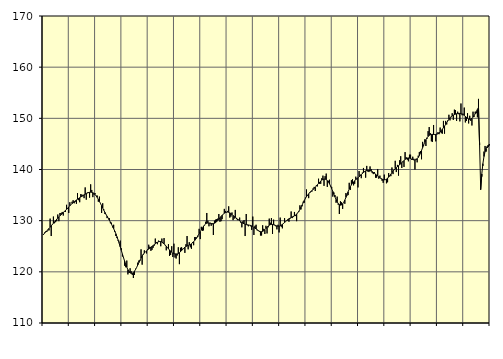
| Category | Samtliga sysselsatta (inkl. sysselsatta utomlands) | Series 1 |
|---|---|---|
| nan | 127.2 | 127.34 |
| 87.0 | 127.7 | 127.56 |
| 87.0 | 127.9 | 127.76 |
| 87.0 | 127.8 | 128 |
| 87.0 | 128.1 | 128.24 |
| 87.0 | 128.1 | 128.49 |
| 87.0 | 130.4 | 128.73 |
| 87.0 | 127 | 128.98 |
| 87.0 | 129.3 | 129.24 |
| 87.0 | 130.8 | 129.5 |
| 87.0 | 129.5 | 129.76 |
| 87.0 | 129.7 | 130.01 |
| nan | 129.9 | 130.27 |
| 88.0 | 131.2 | 130.51 |
| 88.0 | 129.9 | 130.74 |
| 88.0 | 131.5 | 130.96 |
| 88.0 | 131.5 | 131.17 |
| 88.0 | 131.7 | 131.37 |
| 88.0 | 131 | 131.57 |
| 88.0 | 131.7 | 131.78 |
| 88.0 | 131.7 | 132 |
| 88.0 | 133.1 | 132.22 |
| 88.0 | 132.3 | 132.44 |
| 88.0 | 131.5 | 132.67 |
| nan | 133.6 | 132.9 |
| 89.0 | 133.1 | 133.12 |
| 89.0 | 133.7 | 133.34 |
| 89.0 | 134 | 133.53 |
| 89.0 | 133.4 | 133.71 |
| 89.0 | 133.7 | 133.88 |
| 89.0 | 133.3 | 134.04 |
| 89.0 | 135.4 | 134.2 |
| 89.0 | 134 | 134.35 |
| 89.0 | 133.6 | 134.48 |
| 89.0 | 135.2 | 134.62 |
| 89.0 | 135.1 | 134.76 |
| nan | 134.8 | 134.91 |
| 90.0 | 134.4 | 135.05 |
| 90.0 | 136.5 | 135.18 |
| 90.0 | 134.1 | 135.3 |
| 90.0 | 135.5 | 135.4 |
| 90.0 | 135.6 | 135.48 |
| 90.0 | 134.5 | 135.54 |
| 90.0 | 137.1 | 135.56 |
| 90.0 | 136 | 135.54 |
| 90.0 | 134.6 | 135.46 |
| 90.0 | 135.1 | 135.32 |
| 90.0 | 135.4 | 135.12 |
| nan | 134.9 | 134.85 |
| 91.0 | 134.9 | 134.54 |
| 91.0 | 133.7 | 134.17 |
| 91.0 | 134.7 | 133.77 |
| 91.0 | 133.3 | 133.35 |
| 91.0 | 131.5 | 132.91 |
| 91.0 | 133.4 | 132.47 |
| 91.0 | 132.2 | 132.04 |
| 91.0 | 131.3 | 131.63 |
| 91.0 | 131.2 | 131.24 |
| 91.0 | 130.5 | 130.87 |
| 91.0 | 130.5 | 130.5 |
| nan | 130.5 | 130.12 |
| 92.0 | 129.5 | 129.73 |
| 92.0 | 129.6 | 129.32 |
| 92.0 | 128.7 | 128.89 |
| 92.0 | 129.2 | 128.44 |
| 92.0 | 127.8 | 127.96 |
| 92.0 | 127 | 127.44 |
| 92.0 | 126.6 | 126.87 |
| 92.0 | 126.1 | 126.25 |
| 92.0 | 125.7 | 125.59 |
| 92.0 | 126.1 | 124.89 |
| 92.0 | 124.6 | 124.18 |
| nan | 123 | 123.47 |
| 93.0 | 122.9 | 122.77 |
| 93.0 | 121.2 | 122.1 |
| 93.0 | 120.9 | 121.47 |
| 93.0 | 122.2 | 120.9 |
| 93.0 | 119.5 | 120.42 |
| 93.0 | 119.8 | 120.05 |
| 93.0 | 120.7 | 119.8 |
| 93.0 | 120.1 | 119.7 |
| 93.0 | 119.4 | 119.72 |
| 93.0 | 118.8 | 119.87 |
| 93.0 | 119.4 | 120.12 |
| nan | 120.6 | 120.47 |
| 94.0 | 120.9 | 120.88 |
| 94.0 | 121.8 | 121.34 |
| 94.0 | 122.2 | 121.81 |
| 94.0 | 122.1 | 122.27 |
| 94.0 | 124.4 | 122.7 |
| 94.0 | 121.4 | 123.1 |
| 94.0 | 123.3 | 123.42 |
| 94.0 | 124.2 | 123.69 |
| 94.0 | 123.9 | 123.9 |
| 94.0 | 123.6 | 124.09 |
| 94.0 | 124.4 | 124.27 |
| nan | 125.3 | 124.45 |
| 95.0 | 124.9 | 124.62 |
| 95.0 | 124.1 | 124.8 |
| 95.0 | 124.3 | 124.96 |
| 95.0 | 124.7 | 125.13 |
| 95.0 | 125.1 | 125.3 |
| 95.0 | 126.5 | 125.47 |
| 95.0 | 125.8 | 125.63 |
| 95.0 | 125.4 | 125.77 |
| 95.0 | 126.1 | 125.88 |
| 95.0 | 126 | 125.93 |
| 95.0 | 125 | 125.92 |
| nan | 126.5 | 125.83 |
| 96.0 | 125.6 | 125.67 |
| 96.0 | 126.6 | 125.47 |
| 96.0 | 125.2 | 125.25 |
| 96.0 | 124.2 | 125 |
| 96.0 | 124.7 | 124.75 |
| 96.0 | 125.4 | 124.51 |
| 96.0 | 123.1 | 124.26 |
| 96.0 | 123.3 | 124.04 |
| 96.0 | 125 | 123.84 |
| 96.0 | 122.9 | 123.68 |
| 96.0 | 125.5 | 123.58 |
| nan | 122.8 | 123.51 |
| 97.0 | 122.6 | 123.49 |
| 97.0 | 123.2 | 123.51 |
| 97.0 | 124.8 | 123.59 |
| 97.0 | 121.5 | 123.73 |
| 97.0 | 124.7 | 123.93 |
| 97.0 | 124.8 | 124.16 |
| 97.0 | 124.5 | 124.4 |
| 97.0 | 124.6 | 124.62 |
| 97.0 | 123.7 | 124.82 |
| 97.0 | 125.4 | 124.96 |
| 97.0 | 127 | 125.07 |
| nan | 124.4 | 125.15 |
| 98.0 | 125.8 | 125.23 |
| 98.0 | 124.8 | 125.34 |
| 98.0 | 124.5 | 125.48 |
| 98.0 | 125.8 | 125.66 |
| 98.0 | 125.2 | 125.89 |
| 98.0 | 126.8 | 126.14 |
| 98.0 | 126.8 | 126.42 |
| 98.0 | 126.8 | 126.73 |
| 98.0 | 126.9 | 127.08 |
| 98.0 | 128.4 | 127.45 |
| 98.0 | 126.4 | 127.82 |
| nan | 128.8 | 128.2 |
| 99.0 | 128 | 128.57 |
| 99.0 | 128.1 | 128.9 |
| 99.0 | 129.1 | 129.18 |
| 99.0 | 129.8 | 129.39 |
| 99.0 | 131.5 | 129.5 |
| 99.0 | 130 | 129.55 |
| 99.0 | 128.9 | 129.53 |
| 99.0 | 129.6 | 129.49 |
| 99.0 | 129 | 129.45 |
| 99.0 | 129.3 | 129.42 |
| 99.0 | 127.2 | 129.43 |
| nan | 130 | 129.5 |
| 0.0 | 130.2 | 129.62 |
| 0.0 | 130.3 | 129.8 |
| 0.0 | 130.4 | 130.03 |
| 0.0 | 131.3 | 130.29 |
| 0.0 | 129.8 | 130.56 |
| 0.0 | 129.9 | 130.81 |
| 0.0 | 130.3 | 131.06 |
| 0.0 | 131.3 | 131.27 |
| 0.0 | 132.3 | 131.45 |
| 0.0 | 131.9 | 131.58 |
| 0.0 | 131.6 | 131.65 |
| nan | 131.9 | 131.68 |
| 1.0 | 132.8 | 131.63 |
| 1.0 | 130.6 | 131.53 |
| 1.0 | 130.8 | 131.38 |
| 1.0 | 131.6 | 131.2 |
| 1.0 | 130.1 | 131.01 |
| 1.0 | 130.4 | 130.83 |
| 1.0 | 132.1 | 130.66 |
| 1.0 | 130.3 | 130.49 |
| 1.0 | 130.1 | 130.31 |
| 1.0 | 130.2 | 130.14 |
| 1.0 | 130.6 | 129.97 |
| nan | 129.6 | 129.8 |
| 2.0 | 128.7 | 129.64 |
| 2.0 | 129.9 | 129.51 |
| 2.0 | 130.1 | 129.39 |
| 2.0 | 127 | 129.31 |
| 2.0 | 131.3 | 129.24 |
| 2.0 | 129.1 | 129.2 |
| 2.0 | 128.9 | 129.16 |
| 2.0 | 129.1 | 129.12 |
| 2.0 | 128.9 | 129.07 |
| 2.0 | 128.2 | 128.98 |
| 2.0 | 130.8 | 128.86 |
| nan | 127.2 | 128.71 |
| 3.0 | 129 | 128.55 |
| 3.0 | 129.2 | 128.38 |
| 3.0 | 128.1 | 128.22 |
| 3.0 | 128 | 128.07 |
| 3.0 | 127.8 | 127.94 |
| 3.0 | 127.1 | 127.86 |
| 3.0 | 127.1 | 127.85 |
| 3.0 | 129.1 | 127.91 |
| 3.0 | 128.4 | 128.05 |
| 3.0 | 127.4 | 128.25 |
| 3.0 | 129 | 128.48 |
| nan | 127.5 | 128.72 |
| 4.0 | 128.7 | 128.94 |
| 4.0 | 130.4 | 129.11 |
| 4.0 | 129.6 | 129.22 |
| 4.0 | 130.5 | 129.27 |
| 4.0 | 127.4 | 129.26 |
| 4.0 | 130.2 | 129.2 |
| 4.0 | 129.2 | 129.12 |
| 4.0 | 128.9 | 129.03 |
| 4.0 | 128.3 | 128.96 |
| 4.0 | 129.2 | 128.92 |
| 4.0 | 127.7 | 128.94 |
| nan | 130.6 | 129.01 |
| 5.0 | 128.8 | 129.13 |
| 5.0 | 128.5 | 129.28 |
| 5.0 | 129.4 | 129.45 |
| 5.0 | 130.5 | 129.64 |
| 5.0 | 129.8 | 129.83 |
| 5.0 | 130 | 130.03 |
| 5.0 | 130 | 130.21 |
| 5.0 | 129.8 | 130.37 |
| 5.0 | 130.4 | 130.5 |
| 5.0 | 131.8 | 130.62 |
| 5.0 | 130.5 | 130.73 |
| nan | 130.7 | 130.84 |
| 6.0 | 131.7 | 130.95 |
| 6.0 | 130.9 | 131.09 |
| 6.0 | 129.9 | 131.28 |
| 6.0 | 131.5 | 131.53 |
| 6.0 | 131.7 | 131.83 |
| 6.0 | 133 | 132.2 |
| 6.0 | 132.2 | 132.62 |
| 6.0 | 132.8 | 133.06 |
| 6.0 | 133.7 | 133.52 |
| 6.0 | 133.5 | 133.95 |
| 6.0 | 134.5 | 134.35 |
| nan | 136.1 | 134.69 |
| 7.0 | 134.9 | 134.99 |
| 7.0 | 134.4 | 135.25 |
| 7.0 | 135.6 | 135.47 |
| 7.0 | 135.8 | 135.68 |
| 7.0 | 135.7 | 135.88 |
| 7.0 | 136.3 | 136.09 |
| 7.0 | 136.6 | 136.3 |
| 7.0 | 135.8 | 136.53 |
| 7.0 | 136.9 | 136.78 |
| 7.0 | 136.7 | 137.03 |
| 7.0 | 138.2 | 137.29 |
| nan | 137.2 | 137.53 |
| 8.0 | 137.2 | 137.74 |
| 8.0 | 138.3 | 137.93 |
| 8.0 | 138.8 | 138.06 |
| 8.0 | 136.8 | 138.13 |
| 8.0 | 138.7 | 138.12 |
| 8.0 | 139.2 | 138.02 |
| 8.0 | 136.6 | 137.83 |
| 8.0 | 137.8 | 137.56 |
| 8.0 | 138 | 137.2 |
| 8.0 | 136.7 | 136.76 |
| 8.0 | 136.6 | 136.26 |
| nan | 134.7 | 135.72 |
| 9.0 | 135.5 | 135.16 |
| 9.0 | 135 | 134.62 |
| 9.0 | 133.5 | 134.12 |
| 9.0 | 134.7 | 133.69 |
| 9.0 | 133.1 | 133.35 |
| 9.0 | 131.3 | 133.13 |
| 9.0 | 133.8 | 133.03 |
| 9.0 | 133.6 | 133.09 |
| 9.0 | 132.3 | 133.28 |
| 9.0 | 133.6 | 133.6 |
| 9.0 | 133.3 | 134.03 |
| nan | 135.4 | 134.55 |
| 10.0 | 134.9 | 135.1 |
| 10.0 | 135 | 135.65 |
| 10.0 | 137.4 | 136.16 |
| 10.0 | 136 | 136.62 |
| 10.0 | 137.9 | 137 |
| 10.0 | 138.1 | 137.32 |
| 10.0 | 136.9 | 137.59 |
| 10.0 | 137.2 | 137.8 |
| 10.0 | 138.6 | 138 |
| 10.0 | 138.3 | 138.19 |
| 10.0 | 136.5 | 138.38 |
| nan | 139.7 | 138.57 |
| 11.0 | 139 | 138.78 |
| 11.0 | 138.3 | 138.99 |
| 11.0 | 139.4 | 139.21 |
| 11.0 | 140.3 | 139.41 |
| 11.0 | 139.5 | 139.59 |
| 11.0 | 138.4 | 139.73 |
| 11.0 | 140.7 | 139.81 |
| 11.0 | 139.6 | 139.85 |
| 11.0 | 139.5 | 139.84 |
| 11.0 | 140.6 | 139.78 |
| 11.0 | 140.1 | 139.69 |
| nan | 139.3 | 139.58 |
| 12.0 | 139.1 | 139.43 |
| 12.0 | 139.5 | 139.27 |
| 12.0 | 138.4 | 139.1 |
| 12.0 | 138.4 | 138.92 |
| 12.0 | 140.1 | 138.74 |
| 12.0 | 138.2 | 138.57 |
| 12.0 | 138.8 | 138.4 |
| 12.0 | 138.3 | 138.25 |
| 12.0 | 137.8 | 138.13 |
| 12.0 | 137.4 | 138.03 |
| 12.0 | 139 | 137.99 |
| nan | 138 | 138.01 |
| 13.0 | 137.3 | 138.11 |
| 13.0 | 137.5 | 138.29 |
| 13.0 | 139.3 | 138.52 |
| 13.0 | 138.7 | 138.8 |
| 13.0 | 138.7 | 139.09 |
| 13.0 | 140.4 | 139.39 |
| 13.0 | 139.1 | 139.67 |
| 13.0 | 140 | 139.93 |
| 13.0 | 141.7 | 140.16 |
| 13.0 | 139.5 | 140.37 |
| 13.0 | 140.9 | 140.56 |
| nan | 138.8 | 140.74 |
| 14.0 | 141.8 | 140.93 |
| 14.0 | 142.6 | 141.12 |
| 14.0 | 140.3 | 141.33 |
| 14.0 | 141.4 | 141.54 |
| 14.0 | 140.5 | 141.76 |
| 14.0 | 143.4 | 141.96 |
| 14.0 | 142.4 | 142.12 |
| 14.0 | 141.9 | 142.23 |
| 14.0 | 141.6 | 142.26 |
| 14.0 | 142.9 | 142.22 |
| 14.0 | 142.9 | 142.15 |
| nan | 141.9 | 142.05 |
| 15.0 | 142.5 | 141.95 |
| 15.0 | 142.1 | 141.87 |
| 15.0 | 140 | 141.86 |
| 15.0 | 142.1 | 141.94 |
| 15.0 | 141.4 | 142.1 |
| 15.0 | 142.7 | 142.36 |
| 15.0 | 143.4 | 142.72 |
| 15.0 | 143.6 | 143.18 |
| 15.0 | 142 | 143.71 |
| 15.0 | 145.4 | 144.28 |
| 15.0 | 144.7 | 144.83 |
| nan | 145.9 | 145.35 |
| 16.0 | 144.6 | 145.81 |
| 16.0 | 146 | 146.19 |
| 16.0 | 147.5 | 146.47 |
| 16.0 | 148.3 | 146.67 |
| 16.0 | 147.1 | 146.8 |
| 16.0 | 145.5 | 146.85 |
| 16.0 | 145.4 | 146.86 |
| 16.0 | 148.7 | 146.84 |
| 16.0 | 146.9 | 146.83 |
| 16.0 | 145.5 | 146.85 |
| 16.0 | 147 | 146.9 |
| nan | 147.3 | 146.99 |
| 17.0 | 146.9 | 147.15 |
| 17.0 | 148.2 | 147.35 |
| 17.0 | 147.1 | 147.6 |
| 17.0 | 147 | 147.87 |
| 17.0 | 149.5 | 148.16 |
| 17.0 | 147 | 148.48 |
| 17.0 | 149.5 | 148.82 |
| 17.0 | 148.8 | 149.17 |
| 17.0 | 149.6 | 149.5 |
| 17.0 | 150.7 | 149.81 |
| 17.0 | 149.6 | 150.09 |
| nan | 150.2 | 150.32 |
| 18.0 | 151 | 150.49 |
| 18.0 | 149.7 | 150.62 |
| 18.0 | 151.7 | 150.73 |
| 18.0 | 151.6 | 150.82 |
| 18.0 | 149.5 | 150.89 |
| 18.0 | 151.3 | 150.94 |
| 18.0 | 150.8 | 150.97 |
| 18.0 | 149.4 | 150.97 |
| 18.0 | 152.9 | 150.94 |
| 18.0 | 150.6 | 150.86 |
| 18.0 | 150.9 | 150.73 |
| nan | 152.1 | 150.57 |
| 19.0 | 149.2 | 150.38 |
| 19.0 | 149.5 | 150.2 |
| 19.0 | 151 | 150.02 |
| 19.0 | 149 | 149.88 |
| 19.0 | 150.5 | 149.82 |
| 19.0 | 149.5 | 149.86 |
| 19.0 | 148.6 | 150 |
| 19.0 | 151.3 | 150.23 |
| 19.0 | 150.3 | 150.54 |
| 19.0 | 151.3 | 150.9 |
| 19.0 | 151 | 151.31 |
| nan | 150.2 | 151.73 |
| 20.0 | 153.8 | 152.15 |
| 20.0 | 145.3 | 144.79 |
| 20.0 | 136 | 136.18 |
| 20.0 | 138.6 | 139.1 |
| 20.0 | 140.7 | 141.14 |
| 20.0 | 143.5 | 142.54 |
| 20.0 | 144.6 | 143.49 |
| 20.0 | 143.5 | 144.11 |
| 20.0 | 144.2 | 144.52 |
| 20.0 | 144.4 | 144.79 |
| 20.0 | 144.7 | 144.98 |